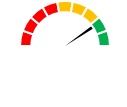
| Category | Series 1 |
|---|---|
| 0 | 0.814 |
| 1 | 0.03 |
| 2 | 1.206 |